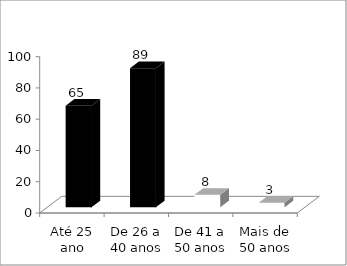
| Category | Respondentes |
|---|---|
| Até 25 ano | 65 |
| De 26 a 40 anos | 89 |
| De 41 a 50 anos | 8 |
| Mais de 50 anos | 3 |